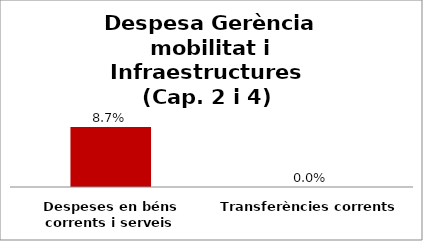
| Category | Series 0 |
|---|---|
| Despeses en béns corrents i serveis | 0.087 |
| Transferències corrents | 0 |